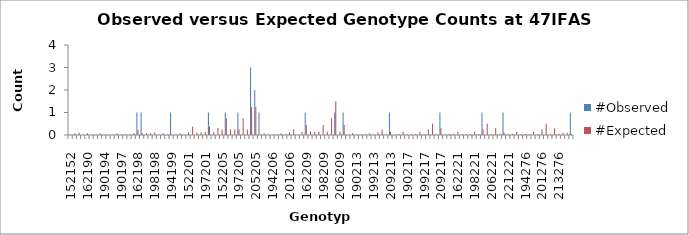
| Category | #Observed | #Expected |
|---|---|---|
| 152152.0 | 0 | 0.012 |
| 152162.0 | 0 | 0.075 |
| 162162.0 | 0 | 0.112 |
| 152190.0 | 0 | 0.025 |
| 162190.0 | 0 | 0.075 |
| 190190.0 | 0 | 0.012 |
| 152194.0 | 0 | 0.025 |
| 162194.0 | 0 | 0.075 |
| 190194.0 | 0 | 0.025 |
| 194194.0 | 0 | 0.012 |
| 152197.0 | 0 | 0.025 |
| 162197.0 | 0 | 0.075 |
| 190197.0 | 0 | 0.025 |
| 194197.0 | 0 | 0.025 |
| 197197.0 | 0 | 0.012 |
| 152198.0 | 0 | 0.075 |
| 162198.0 | 1 | 0.225 |
| 190198.0 | 1 | 0.075 |
| 194198.0 | 0 | 0.075 |
| 197198.0 | 0 | 0.075 |
| 198198.0 | 0 | 0.112 |
| 152199.0 | 0 | 0.025 |
| 162199.0 | 0 | 0.075 |
| 190199.0 | 0 | 0.025 |
| 194199.0 | 1 | 0.025 |
| 197199.0 | 0 | 0.025 |
| 198199.0 | 0 | 0.075 |
| 199199.0 | 0 | 0.012 |
| 152201.0 | 0 | 0.125 |
| 162201.0 | 0 | 0.375 |
| 190201.0 | 0 | 0.125 |
| 194201.0 | 0 | 0.125 |
| 197201.0 | 0 | 0.125 |
| 198201.0 | 1 | 0.375 |
| 199201.0 | 0 | 0.125 |
| 201201.0 | 0 | 0.312 |
| 152205.0 | 0 | 0.25 |
| 162205.0 | 1 | 0.75 |
| 190205.0 | 0 | 0.25 |
| 194205.0 | 0 | 0.25 |
| 197205.0 | 1 | 0.25 |
| 198205.0 | 0 | 0.75 |
| 199205.0 | 0 | 0.25 |
| 201205.0 | 3 | 1.25 |
| 205205.0 | 2 | 1.25 |
| 152206.0 | 1 | 0.025 |
| 162206.0 | 0 | 0.075 |
| 190206.0 | 0 | 0.025 |
| 194206.0 | 0 | 0.025 |
| 197206.0 | 0 | 0.025 |
| 198206.0 | 0 | 0.075 |
| 199206.0 | 0 | 0.025 |
| 201206.0 | 0 | 0.125 |
| 205206.0 | 0 | 0.25 |
| 206206.0 | 0 | 0.012 |
| 152209.0 | 0 | 0.15 |
| 162209.0 | 1 | 0.45 |
| 190209.0 | 0 | 0.15 |
| 194209.0 | 0 | 0.15 |
| 197209.0 | 0 | 0.15 |
| 198209.0 | 0 | 0.45 |
| 199209.0 | 0 | 0.15 |
| 201209.0 | 0 | 0.75 |
| 205209.0 | 1 | 1.5 |
| 206209.0 | 0 | 0.15 |
| 209209.0 | 1 | 0.45 |
| 152213.0 | 0 | 0.025 |
| 162213.0 | 0 | 0.075 |
| 190213.0 | 0 | 0.025 |
| 194213.0 | 0 | 0.025 |
| 197213.0 | 0 | 0.025 |
| 198213.0 | 0 | 0.075 |
| 199213.0 | 0 | 0.025 |
| 201213.0 | 0 | 0.125 |
| 205213.0 | 0 | 0.25 |
| 206213.0 | 0 | 0.025 |
| 209213.0 | 1 | 0.15 |
| 213213.0 | 0 | 0.012 |
| 152217.0 | 0 | 0.05 |
| 162217.0 | 0 | 0.15 |
| 190217.0 | 0 | 0.05 |
| 194217.0 | 0 | 0.05 |
| 197217.0 | 0 | 0.05 |
| 198217.0 | 0 | 0.15 |
| 199217.0 | 0 | 0.05 |
| 201217.0 | 0 | 0.25 |
| 205217.0 | 0 | 0.5 |
| 206217.0 | 0 | 0.05 |
| 209217.0 | 1 | 0.3 |
| 213217.0 | 0 | 0.05 |
| 217217.0 | 0 | 0.05 |
| 152221.0 | 0 | 0.05 |
| 162221.0 | 0 | 0.15 |
| 190221.0 | 0 | 0.05 |
| 194221.0 | 0 | 0.05 |
| 197221.0 | 0 | 0.05 |
| 198221.0 | 0 | 0.15 |
| 199221.0 | 0 | 0.05 |
| 201221.0 | 1 | 0.25 |
| 205221.0 | 0 | 0.5 |
| 206221.0 | 0 | 0.05 |
| 209221.0 | 0 | 0.3 |
| 213221.0 | 0 | 0.05 |
| 217221.0 | 1 | 0.1 |
| 221221.0 | 0 | 0.05 |
| 152276.0 | 0 | 0.05 |
| 162276.0 | 0 | 0.15 |
| 190276.0 | 0 | 0.05 |
| 194276.0 | 0 | 0.05 |
| 197276.0 | 0 | 0.05 |
| 198276.0 | 0 | 0.15 |
| 199276.0 | 0 | 0.05 |
| 201276.0 | 0 | 0.25 |
| 205276.0 | 0 | 0.5 |
| 206276.0 | 0 | 0.05 |
| 209276.0 | 0 | 0.3 |
| 213276.0 | 0 | 0.05 |
| 217276.0 | 0 | 0.1 |
| 221276.0 | 0 | 0.1 |
| 276276.0 | 1 | 0.05 |